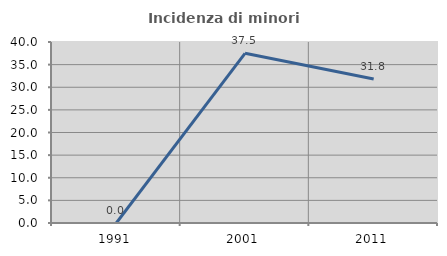
| Category | Incidenza di minori stranieri |
|---|---|
| 1991.0 | 0 |
| 2001.0 | 37.5 |
| 2011.0 | 31.818 |